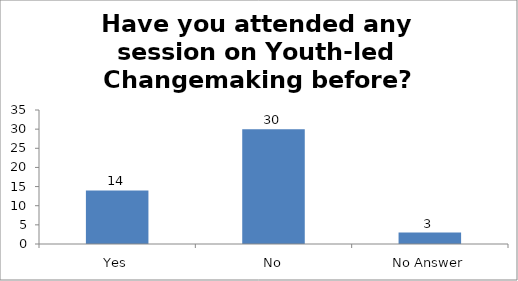
| Category | Have you attended any session on Youth-led Changemaking before? |
|---|---|
| Yes | 14 |
| No | 30 |
| No Answer | 3 |